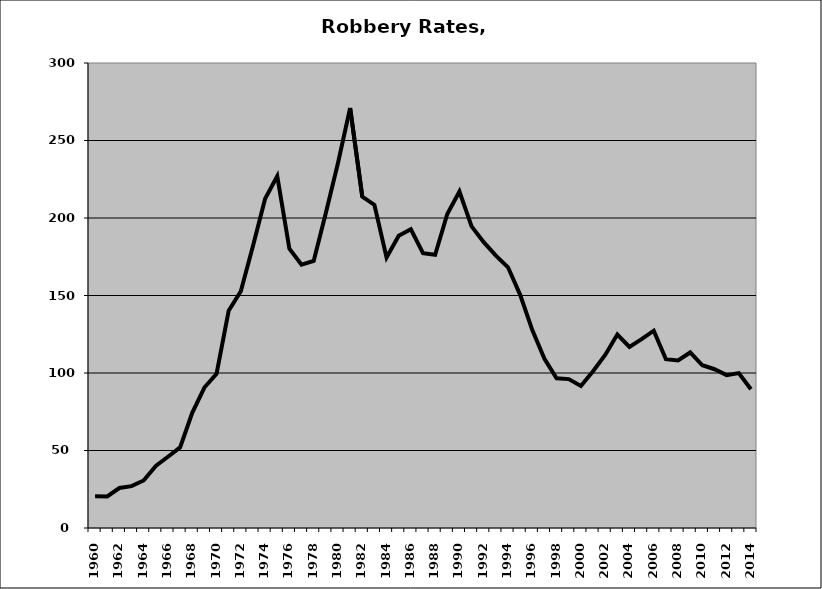
| Category | Robbery |
|---|---|
| 1960.0 | 20.433 |
| 1961.0 | 20.367 |
| 1962.0 | 25.79 |
| 1963.0 | 27.003 |
| 1964.0 | 30.648 |
| 1965.0 | 39.996 |
| 1966.0 | 45.96 |
| 1967.0 | 51.983 |
| 1968.0 | 74.287 |
| 1969.0 | 90.635 |
| 1970.0 | 99.452 |
| 1971.0 | 140.135 |
| 1972.0 | 152.756 |
| 1973.0 | 181.953 |
| 1974.0 | 212.362 |
| 1975.0 | 226.99 |
| 1976.0 | 180.169 |
| 1977.0 | 169.872 |
| 1978.0 | 172.272 |
| 1979.0 | 203.224 |
| 1980.0 | 235.533 |
| 1981.0 | 270.936 |
| 1982.0 | 213.787 |
| 1983.0 | 208.479 |
| 1984.0 | 174.577 |
| 1985.0 | 188.492 |
| 1986.0 | 192.713 |
| 1987.0 | 177.267 |
| 1988.0 | 176.324 |
| 1989.0 | 202.604 |
| 1990.0 | 217.106 |
| 1991.0 | 194.613 |
| 1992.0 | 184.378 |
| 1993.0 | 175.699 |
| 1994.0 | 168.184 |
| 1995.0 | 150.428 |
| 1996.0 | 127.676 |
| 1997.0 | 109.121 |
| 1998.0 | 96.6 |
| 1999.0 | 96.046 |
| 2000.0 | 91.588 |
| 2001.0 | 101.169 |
| 2002.0 | 111.635 |
| 2003.0 | 124.775 |
| 2004.0 | 116.803 |
| 2005.0 | 121.818 |
| 2006.0 | 127.276 |
| 2007.0 | 108.903 |
| 2008.0 | 108.06 |
| 2009.0 | 113.246 |
| 2010.0 | 104.985 |
| 2011.0 | 102.437 |
| 2012.0 | 98.641 |
| 2013.0 | 99.942 |
| 2014.0 | 89.483 |